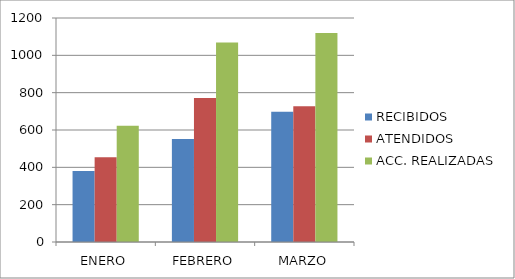
| Category | RECIBIDOS | ATENDIDOS | ACC. REALIZADAS |
|---|---|---|---|
| ENERO | 380 | 454 | 623 |
| FEBRERO | 552 | 772 | 1069 |
| MARZO | 698 | 727 | 1119 |